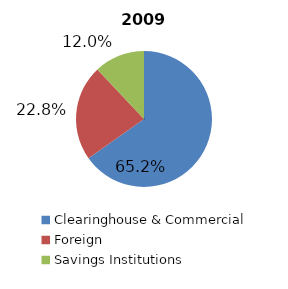
| Category | 2009 |
|---|---|
| Clearinghouse & Commercial | 472 |
| Foreign | 165 |
| Savings Institutions | 87 |